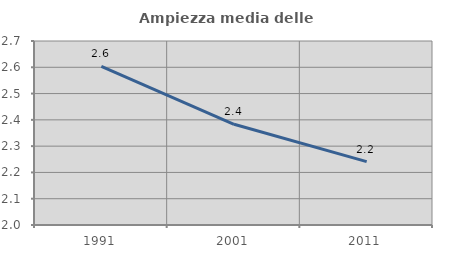
| Category | Ampiezza media delle famiglie |
|---|---|
| 1991.0 | 2.604 |
| 2001.0 | 2.383 |
| 2011.0 | 2.241 |